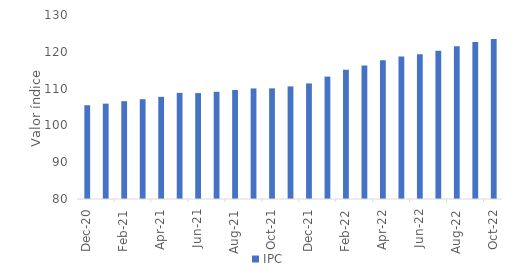
| Category | IPC |
|---|---|
| 2020-12-01 | 105.48 |
| 2021-01-01 | 105.91 |
| 2021-02-01 | 106.58 |
| 2021-03-01 | 107.12 |
| 2021-04-01 | 107.76 |
| 2021-05-01 | 108.84 |
| 2021-06-01 | 108.78 |
| 2021-07-01 | 109.14 |
| 2021-08-01 | 109.62 |
| 2021-09-01 | 110.04 |
| 2021-10-01 | 110.06 |
| 2021-11-01 | 110.6 |
| 2021-12-01 | 111.41 |
| 2022-01-01 | 113.26 |
| 2022-02-01 | 115.11 |
| 2022-03-01 | 116.26 |
| 2022-04-01 | 117.71 |
| 2022-05-01 | 118.7 |
| 2022-06-01 | 119.31 |
| 2022-07-01 | 120.27 |
| 2022-08-01 | 121.5 |
| 2022-09-01 | 122.63 |
| 2022-10-01 | 123.51 |